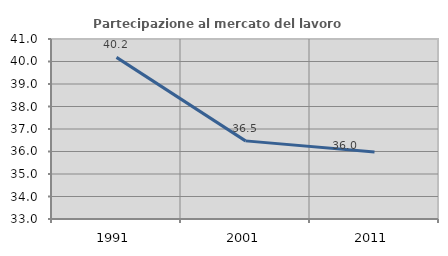
| Category | Partecipazione al mercato del lavoro  femminile |
|---|---|
| 1991.0 | 40.183 |
| 2001.0 | 36.472 |
| 2011.0 | 35.977 |